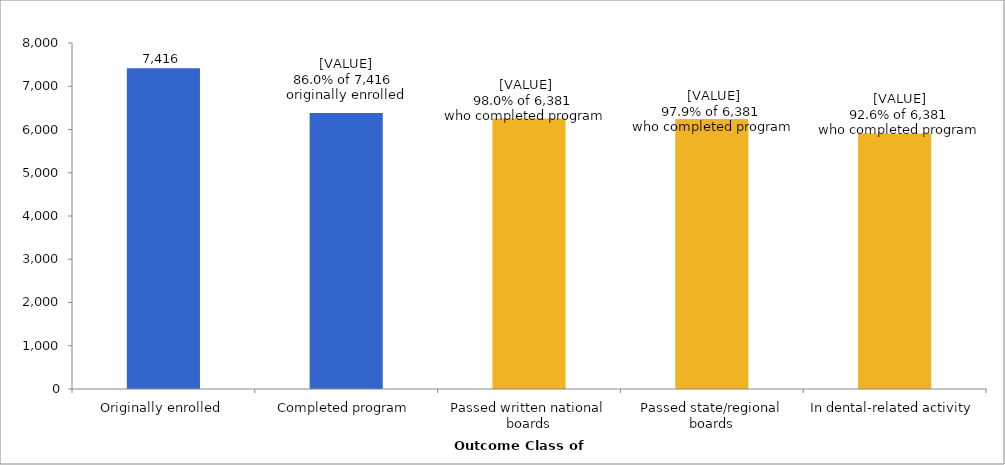
| Category | Series 0 |
|---|---|
| Originally enrolled | 7416 |
| Completed program | 6381 |
| Passed written national boards | 6253 |
| Passed state/regional boards | 6245 |
| In dental-related activity | 5909 |